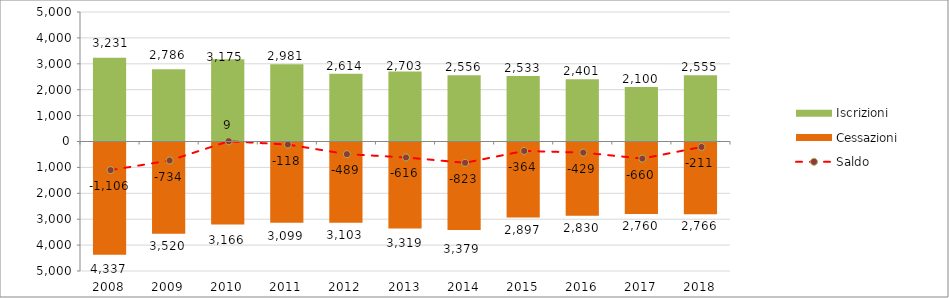
| Category | Iscrizioni | Cessazioni |
|---|---|---|
| 2008.0 | 3231 | -4337 |
| 2009.0 | 2786 | -3520 |
| 2010.0 | 3175 | -3166 |
| 2011.0 | 2981 | -3099 |
| 2012.0 | 2614 | -3103 |
| 2013.0 | 2703 | -3319 |
| 2014.0 | 2556 | -3379 |
| 2015.0 | 2533 | -2897 |
| 2016.0 | 2401 | -2830 |
| 2017.0 | 2100 | -2760 |
| 2018.0 | 2555 | -2766 |